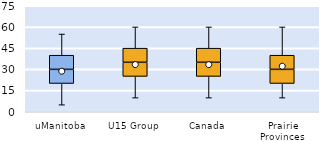
| Category | 25th | 50th | 75th |
|---|---|---|---|
| uManitoba | 20 | 10 | 10 |
| U15 Group | 25 | 10 | 10 |
| Canada | 25 | 10 | 10 |
| Prairie Provinces | 20 | 10 | 10 |